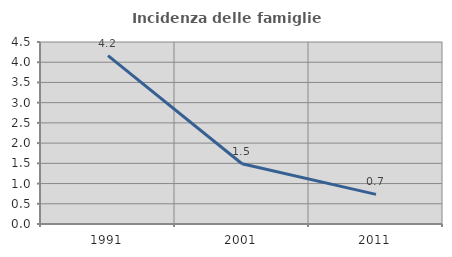
| Category | Incidenza delle famiglie numerose |
|---|---|
| 1991.0 | 4.162 |
| 2001.0 | 1.49 |
| 2011.0 | 0.733 |